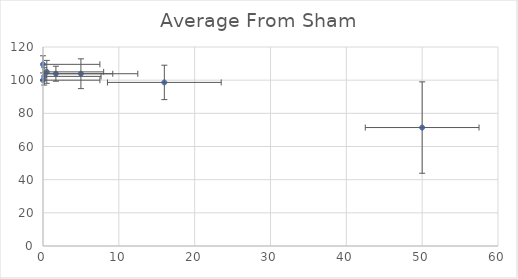
| Category | Average From Sham |
|---|---|
| 50.0 | 71.43 |
| 16.0 | 98.644 |
| 5.0 | 103.884 |
| 1.7 | 103.887 |
| 0.5 | 105.007 |
| 0.16 | 102.284 |
| 0.0 | 100 |
| 0.0 | 109.538 |